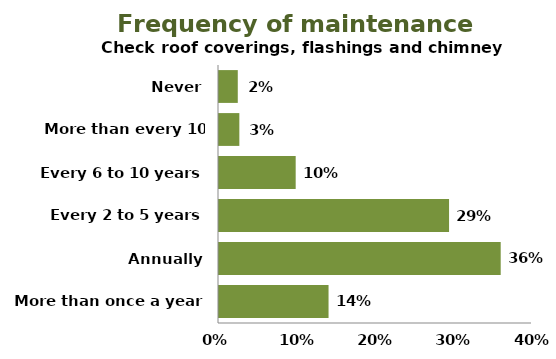
| Category | % |
|---|---|
| More than once a year | 0.14 |
| Annually | 0.36 |
| Every 2 to 5 years | 0.294 |
| Every 6 to 10 years | 0.098 |
| More than every 10 years | 0.026 |
| Never | 0.024 |